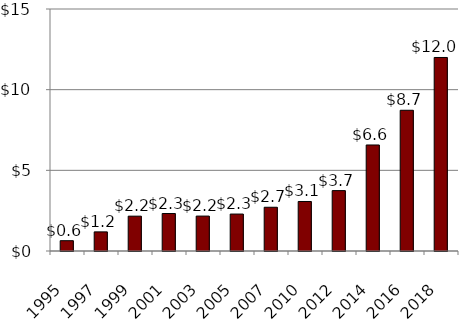
| Category | Series 0 |
|---|---|
| 1995.0 | 639 |
| 1997.0 | 1185 |
| 1999.0 | 2159 |
| 2001.0 | 2323 |
| 2003.0 | 2164 |
| 2005.0 | 2290 |
| 2007.0 | 2711 |
| 2010.0 | 3069 |
| 2012.0 | 3743 |
| 2014.0 | 6572 |
| 2016.0 | 8723 |
| 2018.0 | 11995 |